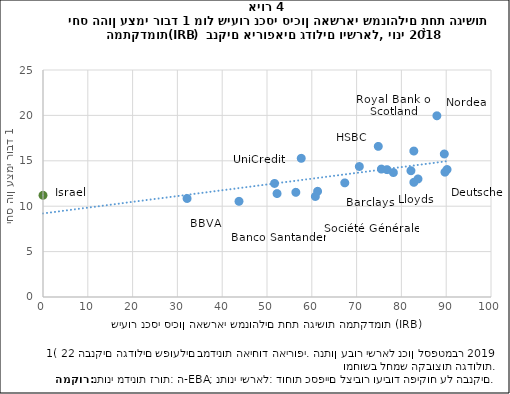
| Category | Banco Bilbao Vizcaya Argentaria, S.A. |
|---|---|
| 32.162416603427246 | 10.85 |
| 43.74994389776749 | 10.535 |
| 67.36224052537858 | 12.569 |
| 56.4376706700166 | 11.528 |
| 52.245311102637906 | 11.39 |
| 83.70302212040237 | 13.001 |
| 89.57847261348306 | 15.751 |
| 89.7253358084321 | 13.747 |
| 78.2109458003359 | 13.704 |
| 82.77922774743246 | 12.628 |
| 57.641267657549214 | 15.272 |
| 70.6130703422319 | 14.371 |
| 74.83990602976831 | 16.589 |
| 75.53341608004949 | 14.088 |
| 90.19088534749355 | 14.042 |
| 61.29489362685989 | 11.639 |
| 82.1280714821627 | 13.907 |
| 87.92043992107352 | 19.958 |
| 60.79303201769603 | 11.071 |
| 76.78693611822489 | 14.025 |
| 82.77233423186394 | 16.073 |
| 51.68518082550809 | 12.506 |
| 0.0 | 11.2 |